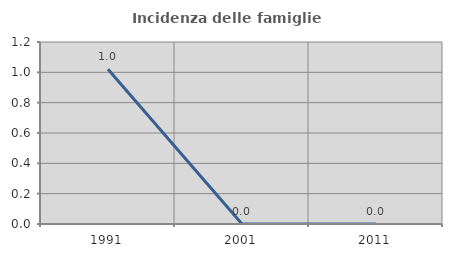
| Category | Incidenza delle famiglie numerose |
|---|---|
| 1991.0 | 1.02 |
| 2001.0 | 0 |
| 2011.0 | 0 |